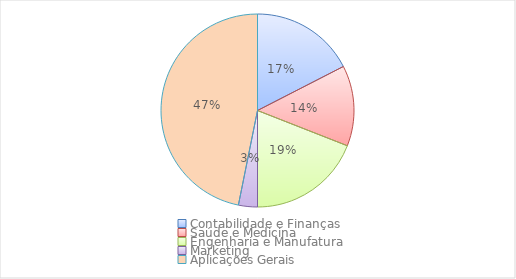
| Category | Series 0 |
|---|---|
| Contabilidade e Finanças | 22 |
| Saúde e Medicina | 17 |
| Engenharia e Manufatura | 24 |
| Marketing | 4 |
| Aplicações Gerais | 59 |